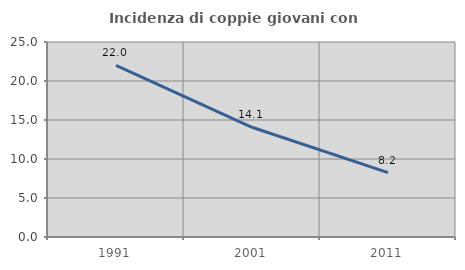
| Category | Incidenza di coppie giovani con figli |
|---|---|
| 1991.0 | 22.002 |
| 2001.0 | 14.069 |
| 2011.0 | 8.247 |